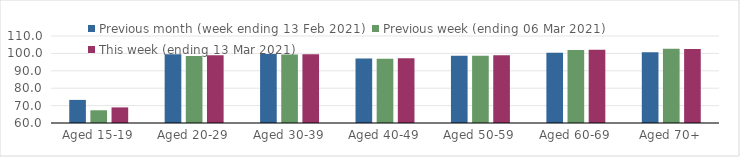
| Category | Previous month (week ending 13 Feb 2021) | Previous week (ending 06 Mar 2021) | This week (ending 13 Mar 2021) |
|---|---|---|---|
| Aged 15-19 | 73.27 | 67.32 | 68.97 |
| Aged 20-29 | 99.48 | 98.53 | 98.95 |
| Aged 30-39 | 99.7 | 99.39 | 99.48 |
| Aged 40-49 | 97.1 | 96.98 | 97.16 |
| Aged 50-59 | 98.72 | 98.65 | 98.91 |
| Aged 60-69 | 100.35 | 101.92 | 102.03 |
| Aged 70+ | 100.6 | 102.68 | 102.49 |